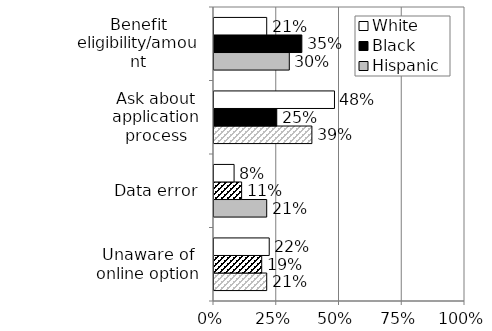
| Category | Hispanic | Black | White |
|---|---|---|---|
| Unaware of online option | 0.21 | 0.19 | 0.22 |
| Data error | 0.21 | 0.11 | 0.08 |
| Ask about application process | 0.39 | 0.25 | 0.48 |
| Benefit eligibility/amount | 0.3 | 0.35 | 0.21 |